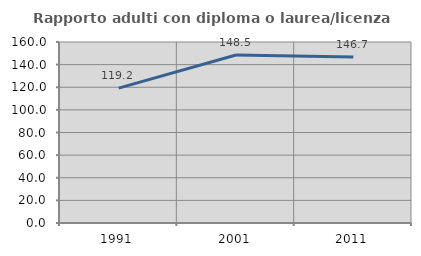
| Category | Rapporto adulti con diploma o laurea/licenza media  |
|---|---|
| 1991.0 | 119.231 |
| 2001.0 | 148.485 |
| 2011.0 | 146.729 |